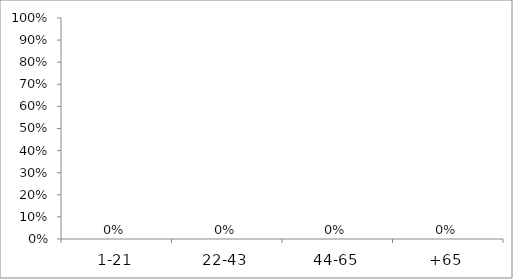
| Category | Series 0 |
|---|---|
| 1-21 | 0 |
| 22-43 | 0 |
| 44-65 | 0 |
| +65 | 0 |